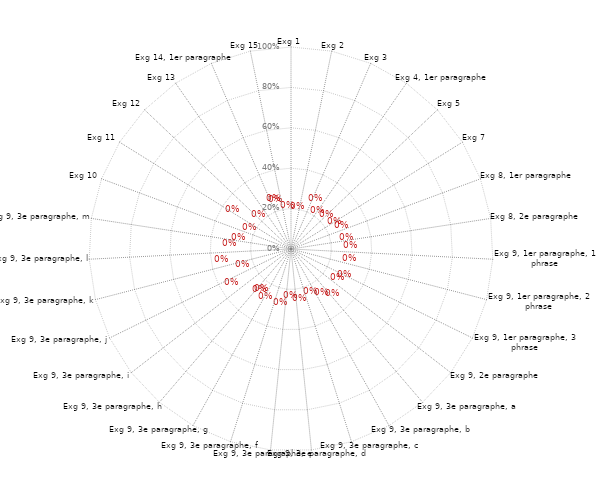
| Category | Résultats |
|---|---|
| Exg 1 | 0 |
| Exg 2 | 0 |
| Exg 3 | 0 |
| Exg 4, 1er paragraphe | 0 |
| Exg 5 | 0 |
| Exg 7 | 0 |
| Exg 8, 1er paragraphe | 0 |
| Exg 8, 2e paragraphe | 0 |
| Exg 9, 1er paragraphe, 1 phrase | 0 |
| Exg 9, 1er paragraphe, 2 phrase | 0 |
| Exg 9, 1er paragraphe, 3 phrase | 0 |
| Exg 9, 2e paragraphe | 0 |
| Exg 9, 3e paragraphe, a | 0 |
| Exg 9, 3e paragraphe, b | 0 |
| Exg 9, 3e paragraphe, c | 0 |
| Exg 9, 3e paragraphe, d | 0 |
| Exg 9, 3e paragraphe, e | 0 |
| Exg 9, 3e paragraphe, f | 0 |
| Exg 9, 3e paragraphe, g | 0 |
| Exg 9, 3e paragraphe, h | 0 |
| Exg 9, 3e paragraphe, i | 0 |
| Exg 9, 3e paragraphe, j | 0 |
| Exg 9, 3e paragraphe, k | 0 |
| Exg 9, 3e paragraphe, l | 0 |
| Exg 9, 3e paragraphe, m | 0 |
| Exg 10 | 0 |
| Exg 11 | 0 |
| Exg 12 | 0 |
| Exg 13 | 0 |
| Exg 14, 1er paragraphe | 0 |
| Exg 15 | 0 |